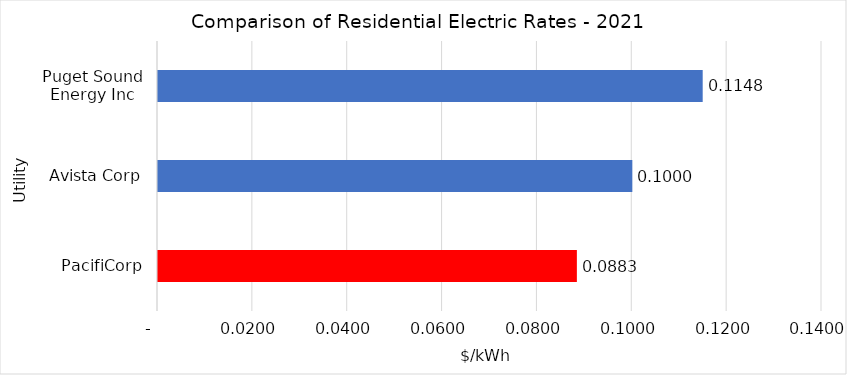
| Category | Series 0 |
|---|---|
| PacifiCorp | 0.088 |
| Avista Corp | 0.1 |
| Puget Sound Energy Inc | 0.115 |